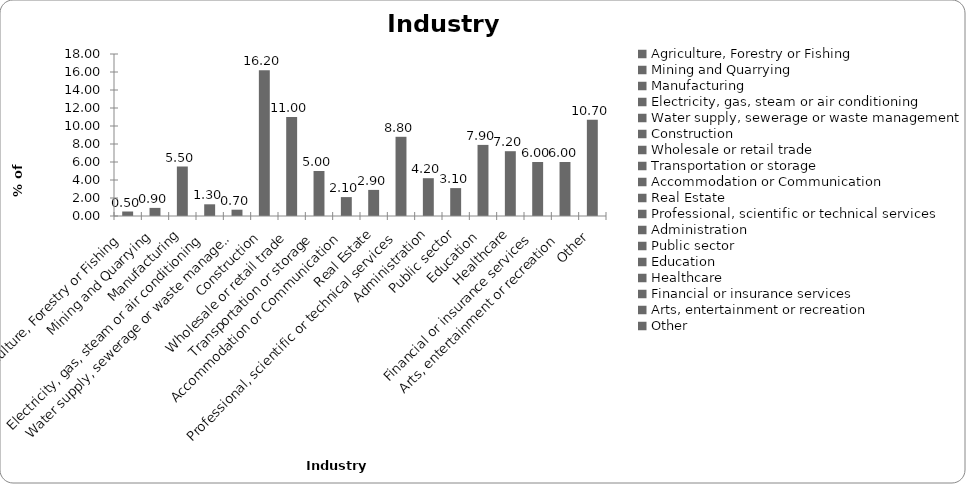
| Category | Series 0 |
|---|---|
| Agriculture, Forestry or Fishing | 0.5 |
| Mining and Quarrying | 0.9 |
| Manufacturing | 5.5 |
| Electricity, gas, steam or air conditioning | 1.3 |
| Water supply, sewerage or waste management | 0.7 |
| Construction | 16.2 |
| Wholesale or retail trade | 11 |
| Transportation or storage | 5 |
| Accommodation or Communication | 2.1 |
| Real Estate | 2.9 |
| Professional, scientific or technical services | 8.8 |
| Administration | 4.2 |
| Public sector | 3.1 |
| Education | 7.9 |
| Healthcare | 7.2 |
| Financial or insurance services | 6 |
| Arts, entertainment or recreation | 6 |
| Other | 10.7 |